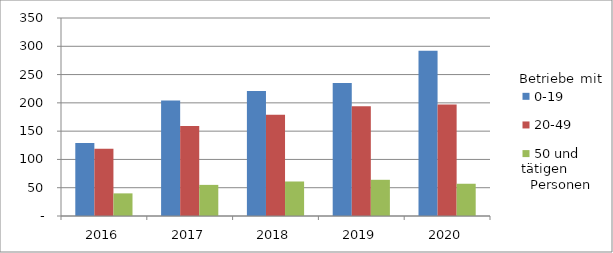
| Category | 0-19 | 20-49 | 50 und mehr |
|---|---|---|---|
| 2016.0 | 129 | 119 | 40 |
| 2017.0 | 204 | 159 | 55 |
| 2018.0 | 221 | 179 | 61 |
| 2019.0 | 235 | 194 | 64 |
| 2020.0 | 292 | 197 | 57 |